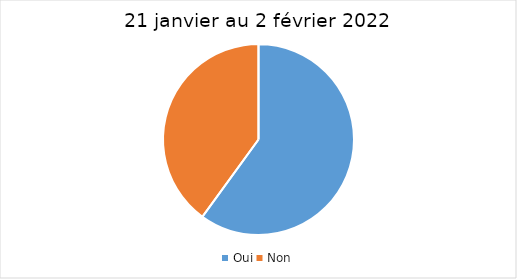
| Category | 21 janvier au 2 février 2022 |
|---|---|
| Oui | 60 |
| Non | 40 |